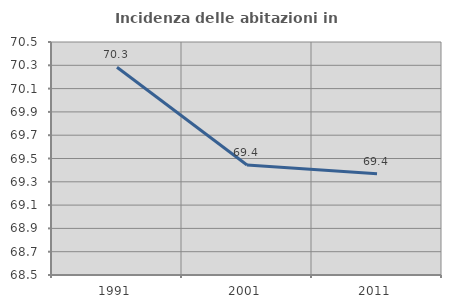
| Category | Incidenza delle abitazioni in proprietà  |
|---|---|
| 1991.0 | 70.283 |
| 2001.0 | 69.444 |
| 2011.0 | 69.369 |